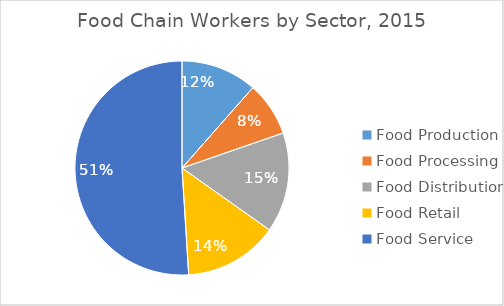
| Category | Series 0 |
|---|---|
| Food Production | 0.115 |
| Food Processing | 0.082 |
| Food Distribution | 0.151 |
| Food Retail | 0.142 |
| Food Service | 0.51 |